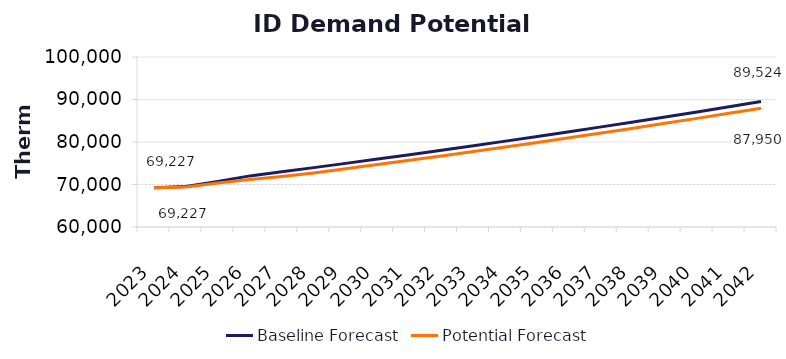
| Category | Baseline Forecast | Potential Forecast |
|---|---|---|
| 2023.0 | 69226.505 | 69226.505 |
| 2024.0 | 69551.643 | 69409.006 |
| 2025.0 | 70729.665 | 70337.945 |
| 2026.0 | 72025.47 | 71153.367 |
| 2027.0 | 72990.726 | 71868.161 |
| 2028.0 | 73971.751 | 72722.322 |
| 2029.0 | 74968.818 | 73697.199 |
| 2030.0 | 75982.206 | 74687.964 |
| 2031.0 | 77012.199 | 75696.767 |
| 2032.0 | 78059.085 | 76722.091 |
| 2033.0 | 79123.159 | 77764.224 |
| 2034.0 | 80204.721 | 78823.458 |
| 2035.0 | 81304.073 | 79900.09 |
| 2036.0 | 82421.528 | 80994.423 |
| 2037.0 | 83557.399 | 82106.765 |
| 2038.0 | 84712.008 | 83237.431 |
| 2039.0 | 85885.681 | 84386.738 |
| 2040.0 | 87078.752 | 85555.013 |
| 2041.0 | 88291.558 | 86742.586 |
| 2042.0 | 89524.443 | 87949.793 |